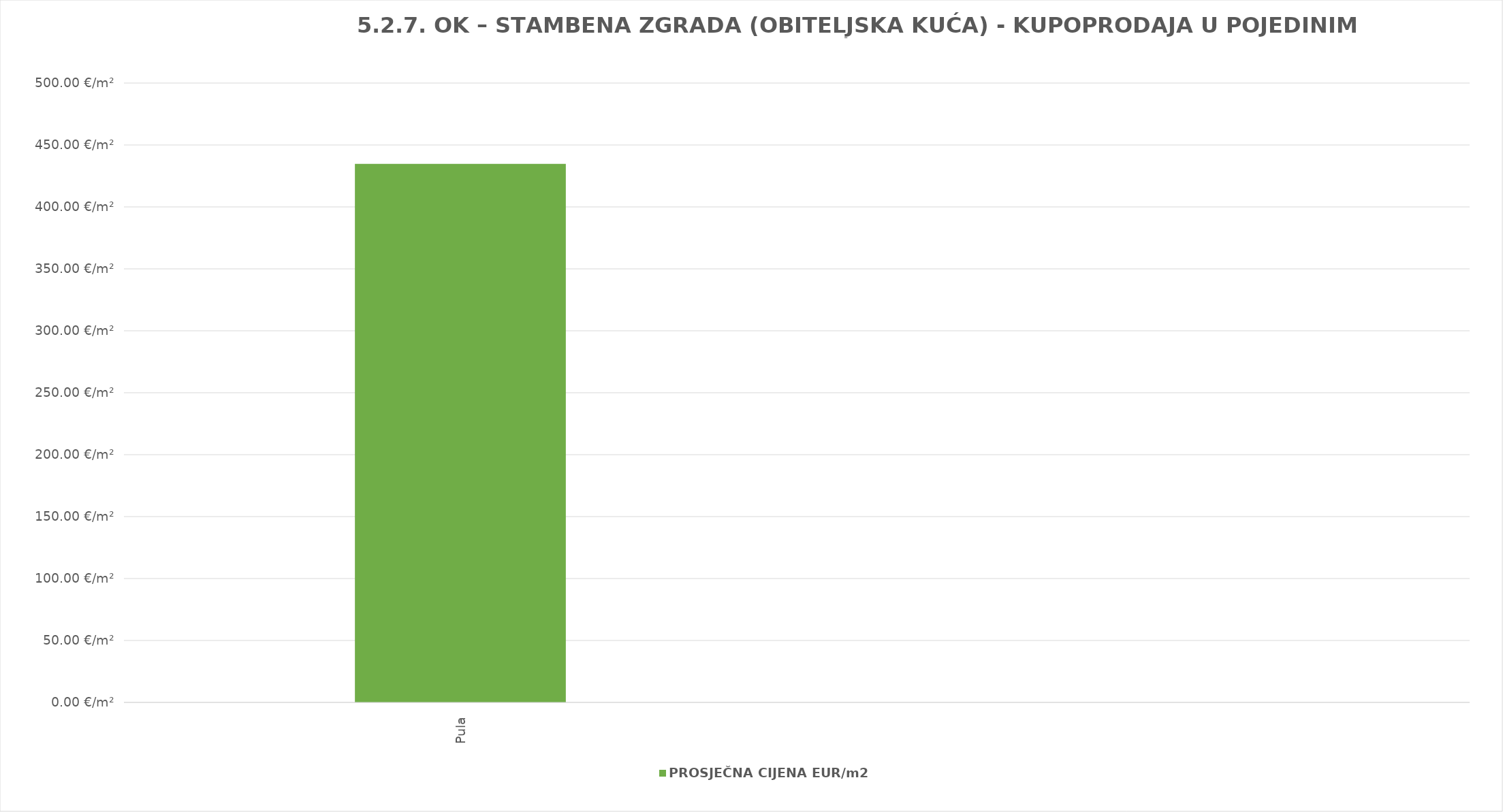
| Category | PROSJEČNA CIJENA EUR/m2 |
|---|---|
| Pula | 1901-03-09 18:32:21 |